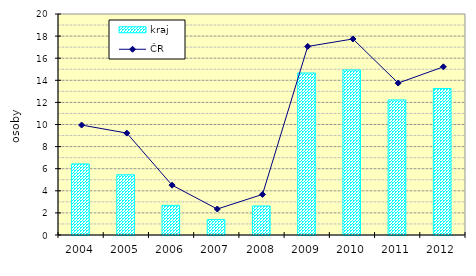
| Category | kraj |
|---|---|
| 2004.0 | 6.434 |
| 2005.0 | 5.45 |
| 2006.0 | 2.682 |
| 2007.0 | 1.396 |
| 2008.0 | 2.626 |
| 2009.0 | 14.663 |
| 2010.0 | 14.939 |
| 2011.0 | 12.224 |
| 2012.0 | 13.255 |